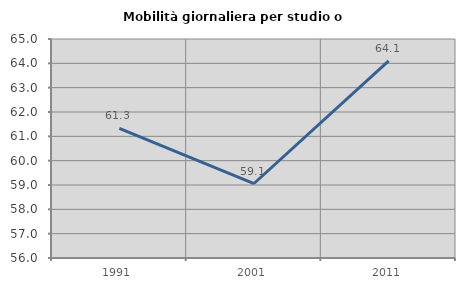
| Category | Mobilità giornaliera per studio o lavoro |
|---|---|
| 1991.0 | 61.325 |
| 2001.0 | 59.061 |
| 2011.0 | 64.097 |